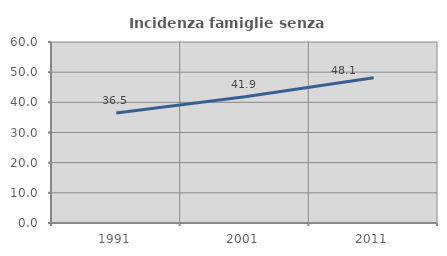
| Category | Incidenza famiglie senza nuclei |
|---|---|
| 1991.0 | 36.481 |
| 2001.0 | 41.85 |
| 2011.0 | 48.113 |